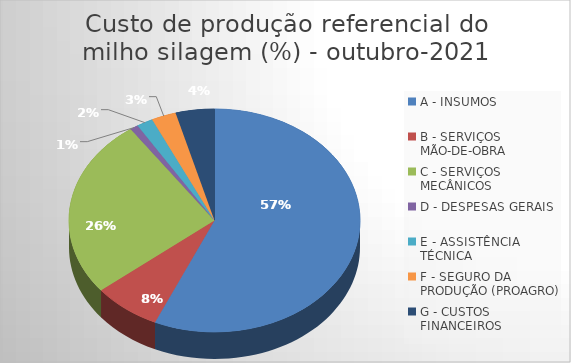
| Category | Series 0 |
|---|---|
| A - INSUMOS | 56.695 |
| B - SERVIÇOS MÃO-DE-OBRA | 7.513 |
| C - SERVIÇOS MECÂNICOS | 26.026 |
| D - DESPESAS GERAIS  | 0.902 |
| E - ASSISTÊNCIA TÉCNICA | 1.823 |
| F - SEGURO DA PRODUÇÃO (PROAGRO) | 2.734 |
| G - CUSTOS FINANCEIROS | 4.306 |